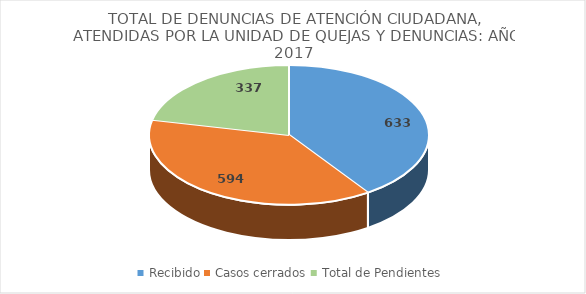
| Category | Series 0 |
|---|---|
| Recibido | 633 |
| Casos cerrados | 594 |
| Total de Pendientes | 337 |